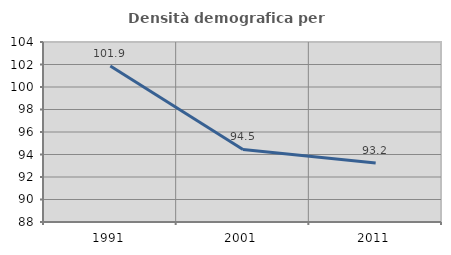
| Category | Densità demografica |
|---|---|
| 1991.0 | 101.869 |
| 2001.0 | 94.453 |
| 2011.0 | 93.246 |